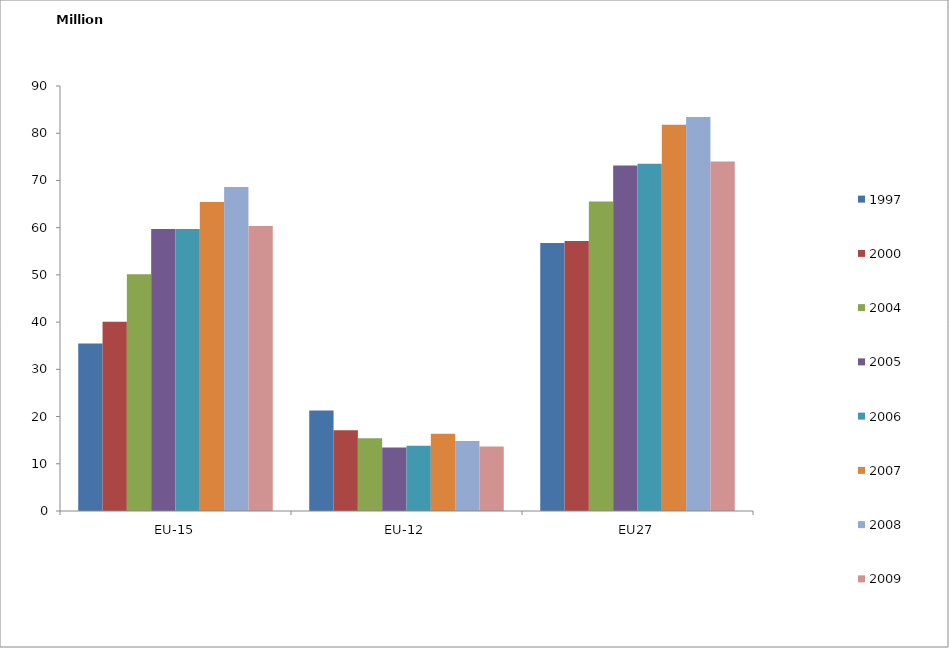
| Category | 1997 | 2000 | 2004 | 2005 | 2006 | 2007 | 2008 | 2009 |
|---|---|---|---|---|---|---|---|---|
| EU-15 | 35.493 | 40.075 | 50.132 | 59.729 | 59.729 | 65.42 | 68.614 | 60.349 |
| EU-12 | 21.28 | 17.089 | 15.385 | 13.424 | 13.817 | 16.378 | 14.819 | 13.678 |
| EU27 | 56.773 | 57.164 | 65.517 | 73.153 | 73.546 | 81.798 | 83.433 | 74.027 |